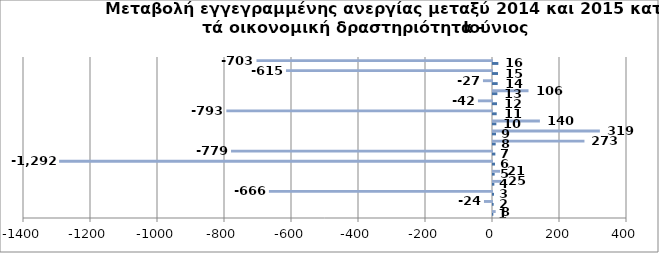
| Category | Series 0 | Series 1 |
|---|---|---|
| 0 | 1 | 8 |
| 1 | 2 | -24 |
| 2 | 3 | -666 |
| 3 | 4 | 25 |
| 4 | 5 | 21 |
| 5 | 6 | -1292 |
| 6 | 7 | -779 |
| 7 | 8 | 273 |
| 8 | 9 | 319 |
| 9 | 10 | 140 |
| 10 | 11 | -793 |
| 11 | 12 | -42 |
| 12 | 13 | 106 |
| 13 | 14 | -27 |
| 14 | 15 | -615 |
| 15 | 16 | -703 |